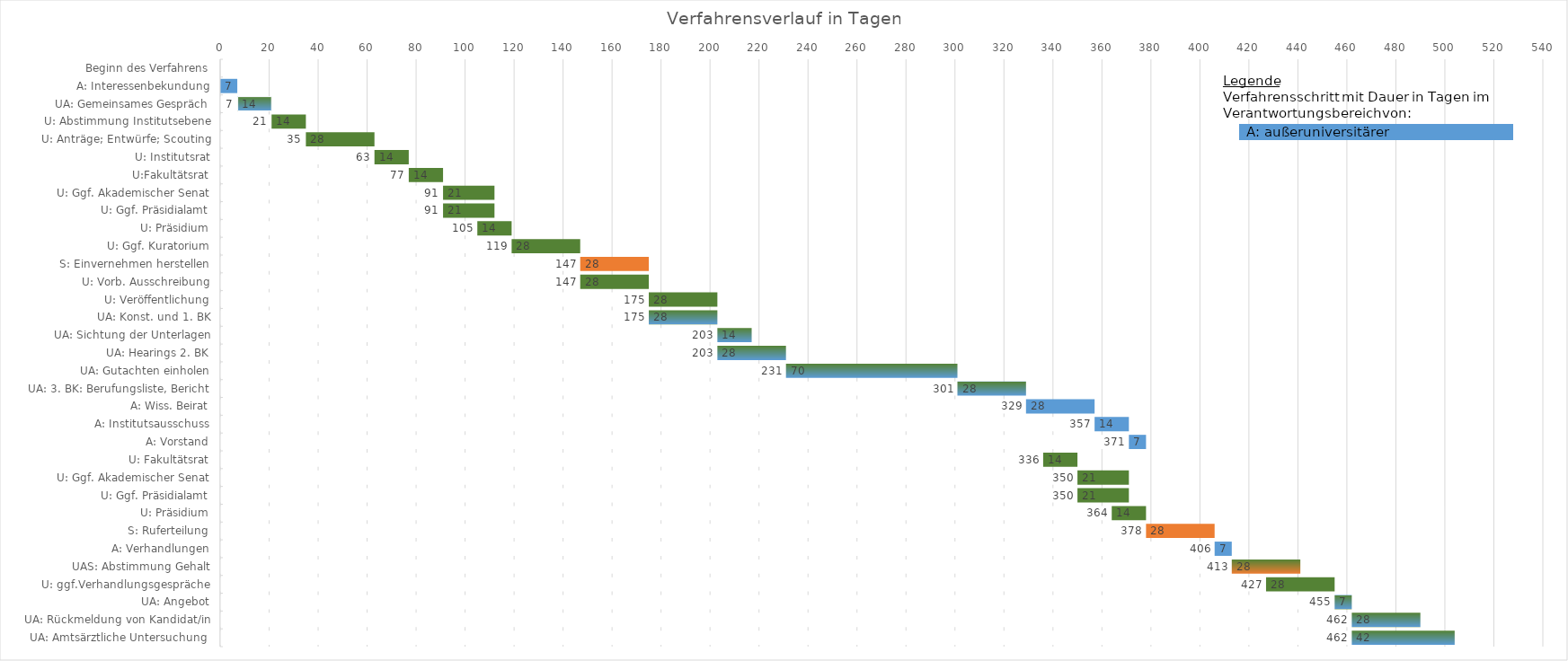
| Category | Gesamtdauer | Duration |
|---|---|---|
| Beginn des Verfahrens | 0 | 0 |
| A: Interessenbekundung | 0 | 7 |
| UA: Gemeinsames Gespräch | 7 | 14 |
| U: Abstimmung Institutsebene | 21 | 14 |
| U: Anträge; Entwürfe; Scouting | 35 | 28 |
| U: Institutsrat | 63 | 14 |
| U:Fakultätsrat | 77 | 14 |
| U: Ggf. Akademischer Senat | 91 | 21 |
| U: Ggf. Präsidialamt | 91 | 21 |
| U: Präsidium | 105 | 14 |
| U: Ggf. Kuratorium | 119 | 28 |
| S: Einvernehmen herstellen | 147 | 28 |
| U: Vorb. Ausschreibung | 147 | 28 |
| U: Veröffentlichung | 175 | 28 |
| UA: Konst. und 1. BK | 175 | 28 |
| UA: Sichtung der Unterlagen | 203 | 14 |
| UA: Hearings 2. BK | 203 | 28 |
| UA: Gutachten einholen | 231 | 70 |
| UA: 3. BK: Berufungsliste, Bericht | 301 | 28 |
| A: Wiss. Beirat | 329 | 28 |
| A: Institutsausschuss | 357 | 14 |
| A: Vorstand | 371 | 7 |
| U: Fakultätsrat | 336 | 14 |
| U: Ggf. Akademischer Senat | 350 | 21 |
| U: Ggf. Präsidialamt | 350 | 21 |
| U: Präsidium | 364 | 14 |
| S: Ruferteilung | 378 | 28 |
| A: Verhandlungen | 406 | 7 |
| UAS: Abstimmung Gehalt | 413 | 28 |
| U: ggf.Verhandlungsgespräche | 427 | 28 |
| UA: Angebot | 455 | 7 |
| UA: Rückmeldung von Kandidat/in | 462 | 28 |
| UA: Amtsärztliche Untersuchung  | 462 | 42 |